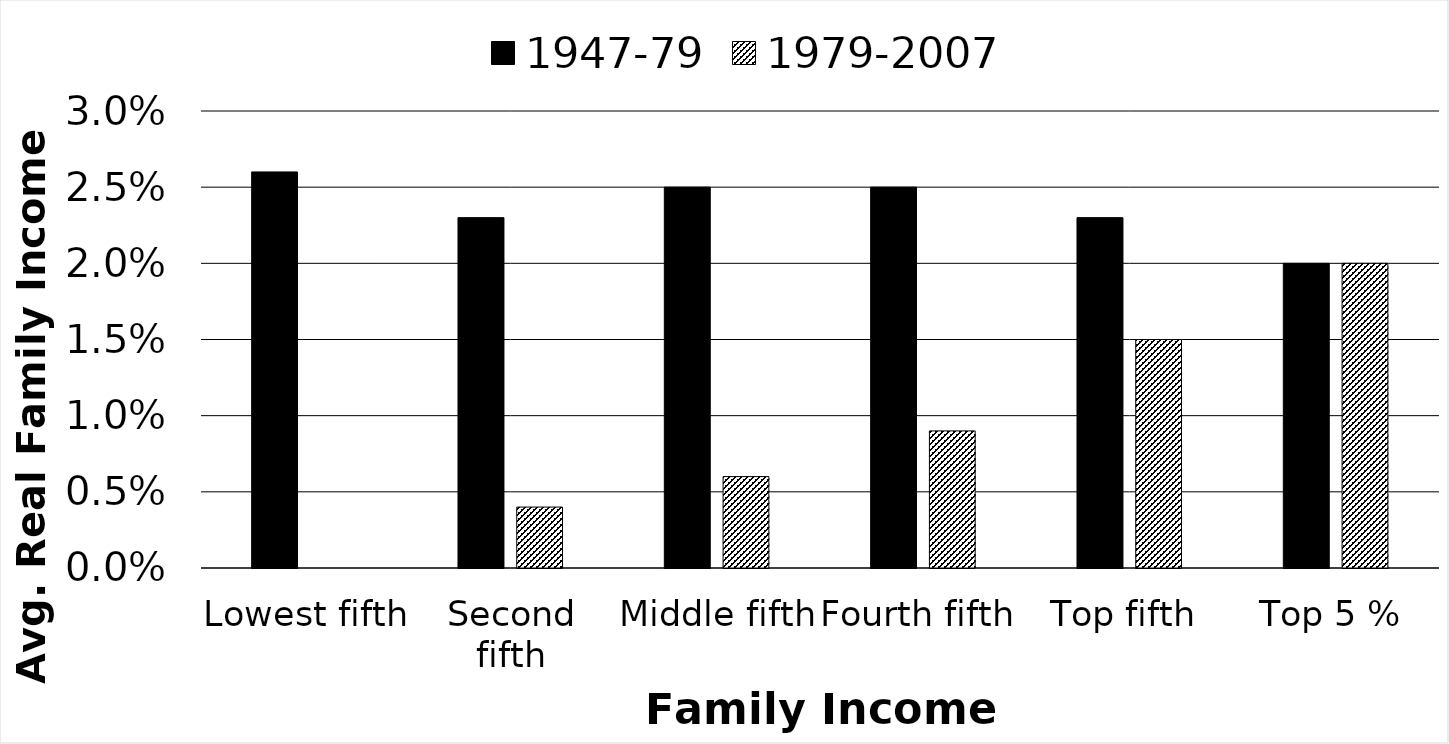
| Category | 1947-79 | 1979-2007 |
|---|---|---|
| Lowest fifth | 0.026 | 0 |
| Second fifth | 0.023 | 0.004 |
| Middle fifth | 0.025 | 0.006 |
| Fourth fifth | 0.025 | 0.009 |
| Top fifth | 0.023 | 0.015 |
| Top 5 % | 0.02 | 0.02 |